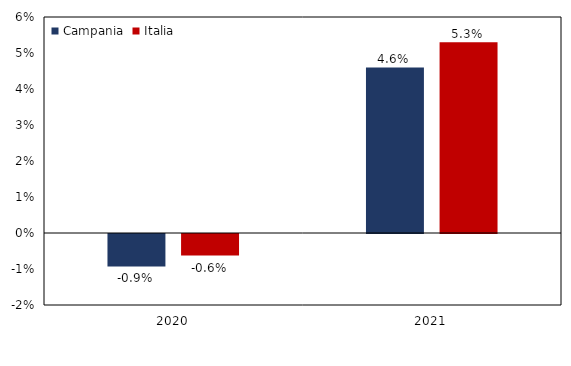
| Category | Campania | Italia |
|---|---|---|
| 2020.0 | -0.009 | -0.006 |
| 2021.0 | 0.046 | 0.053 |